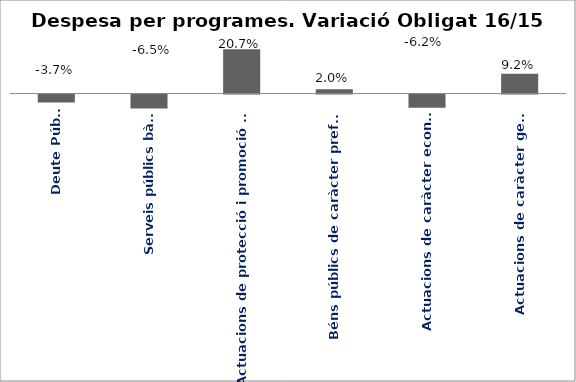
| Category | Series 0 |
|---|---|
| Deute Públic | -0.037 |
| Serveis públics bàsics | -0.065 |
| Actuacions de protecció i promoció social | 0.207 |
| Béns públics de caràcter preferent | 0.02 |
| Actuacions de caràcter econòmic | -0.062 |
| Actuacions de caràcter general | 0.092 |